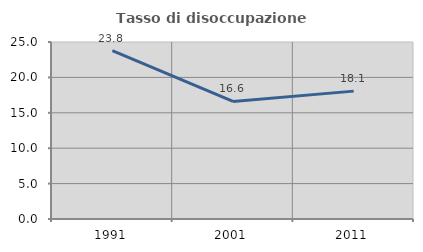
| Category | Tasso di disoccupazione giovanile  |
|---|---|
| 1991.0 | 23.78 |
| 2001.0 | 16.612 |
| 2011.0 | 18.062 |